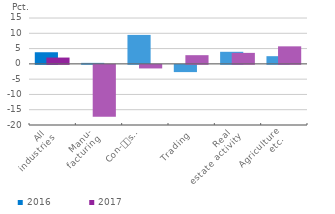
| Category | 2016 | 2017 |
|---|---|---|
| All
industries | 3.799 | 2.06 |
| Manu-
facturing | 0.325 | -17.011 |
| Con-
struction | 9.473 | -1.173 |
| Trading | -2.37 | 2.84 |
| Real
estate activity | 3.946 | 3.593 |
| Agriculture
etc. | 2.51 | 5.731 |